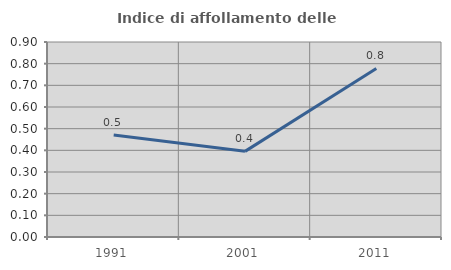
| Category | Indice di affollamento delle abitazioni  |
|---|---|
| 1991.0 | 0.471 |
| 2001.0 | 0.395 |
| 2011.0 | 0.778 |